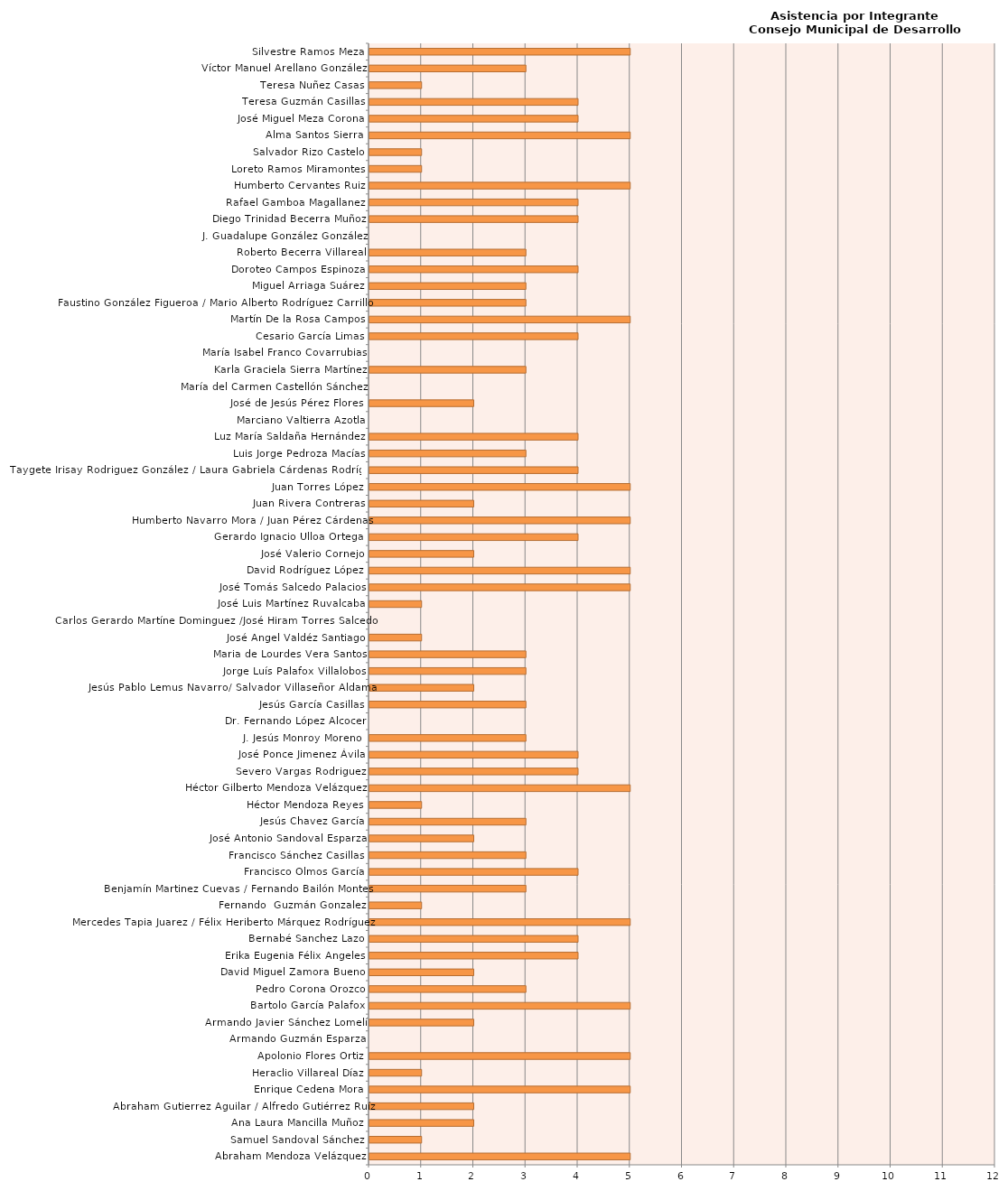
| Category | Series 0 |
|---|---|
| Abraham Mendoza Velázquez | 5 |
| Samuel Sandoval Sánchez | 1 |
| Ana Laura Mancilla Muñoz | 2 |
| Abraham Gutierrez Aguilar / Alfredo Gutiérrez Ruíz | 2 |
| Enrique Cedena Mora | 5 |
| Heraclio Villareal Díaz | 1 |
| Apolonio Flores Ortiz | 5 |
| Armando Guzmán Esparza | 0 |
| Armando Javier Sánchez Lomelí | 2 |
| Bartolo García Palafox | 5 |
| Pedro Corona Orozco | 3 |
| David Miguel Zamora Bueno | 2 |
| Erika Eugenia Félix Angeles | 4 |
| Bernabé Sanchez Lazo | 4 |
| Mercedes Tapia Juarez / Félix Heriberto Márquez Rodríguez | 5 |
| Fernando  Guzmán Gonzalez | 1 |
|  Benjamín Martinez Cuevas / Fernando Bailón Montes | 3 |
| Francisco Olmos García | 4 |
| Francisco Sánchez Casillas | 3 |
| José Antonio Sandoval Esparza | 2 |
| Jesús Chavez García | 3 |
| Héctor Mendoza Reyes | 1 |
| Héctor Gilberto Mendoza Velázquez | 5 |
| Severo Vargas Rodriguez | 4 |
| José Ponce Jimenez Ávila | 4 |
| J. Jesús Monroy Moreno  | 3 |
| Dr. Fernando López Alcocer | 0 |
| Jesús García Casillas | 3 |
| Jesús Pablo Lemus Navarro/ Salvador Villaseñor Aldama | 2 |
| Jorge Luís Palafox Villalobos | 3 |
| Maria de Lourdes Vera Santos | 3 |
| José Angel Valdéz Santiago | 1 |
| Carlos Gerardo Martíne Dominguez /José Hiram Torres Salcedo | 0 |
| José Luis Martínez Ruvalcaba | 1 |
| José Tomás Salcedo Palacios | 5 |
| David Rodríguez López | 5 |
| José Valerio Cornejo | 2 |
| Gerardo Ignacio Ulloa Ortega  | 4 |
| Humberto Navarro Mora / Juan Pérez Cárdenas | 5 |
| Juan Rivera Contreras | 2 |
| Juan Torres López | 5 |
| Taygete Irisay Rodriguez González / Laura Gabriela Cárdenas Rodríguez | 4 |
| Luis Jorge Pedroza Macías | 3 |
| Luz María Saldaña Hernández | 4 |
| Marciano Valtierra Azotla | 0 |
| José de Jesús Pérez Flores  | 2 |
| María del Carmen Castellón Sánchez | 0 |
| Karla Graciela Sierra Martínez | 3 |
| María Isabel Franco Covarrubias | 0 |
| Cesario García Limas | 4 |
| Martín De la Rosa Campos | 5 |
| Faustino González Figueroa / Mario Alberto Rodríguez Carrillo  | 3 |
| Miguel Arriaga Suárez | 3 |
| Doroteo Campos Espinoza | 4 |
| Roberto Becerra Villareal | 3 |
| J. Guadalupe González González | 0 |
| Diego Trinidad Becerra Muñoz | 4 |
| Rafael Gamboa Magallanez | 4 |
| Humberto Cervantes Ruiz | 5 |
| Loreto Ramos Miramontes | 1 |
| Salvador Rizo Castelo | 1 |
| Alma Santos Sierra | 5 |
| José Miguel Meza Corona | 4 |
| Teresa Guzmán Casillas | 4 |
| Teresa Nuñez Casas | 1 |
| Víctor Manuel Arellano González | 3 |
| Silvestre Ramos Meza | 5 |